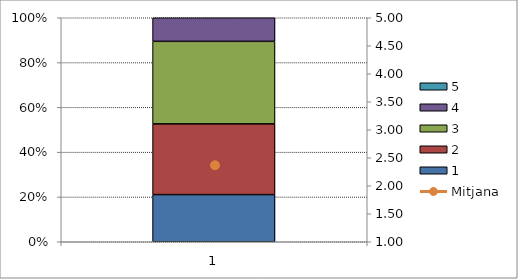
| Category | 1 | 2 | 3 | 4 | 5 |
|---|---|---|---|---|---|
| 0 | 4 | 6 | 7 | 2 | 0 |